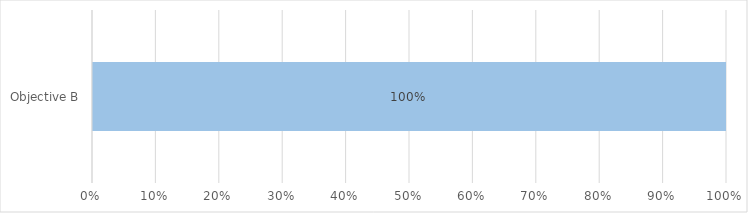
| Category | Not yet assessed | Not Relevant | Not achieved | Partially Achieved | Achieved |
|---|---|---|---|---|---|
| Objective B | 1 | 0 | 0 | 0 | 0 |